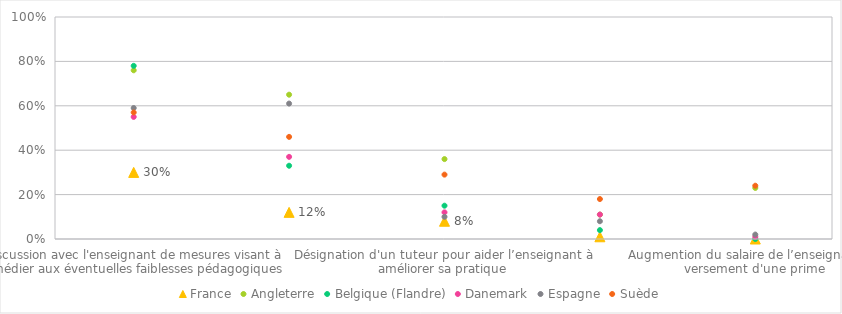
| Category | France | Angleterre | Belgique (Flandre) | Danemark | Espagne | Suède |
|---|---|---|---|---|---|---|
| Discussion avec l'enseignant de mesures visant à remédier aux éventuelles faiblesses pédagogiques | 0.3 | 0.76 | 0.78 | 0.55 | 0.59 | 0.57 |
| Élaboration d'un plan de formation | 0.12 | 0.65 | 0.33 | 0.37 | 0.61 | 0.46 |
| Désignation d'un tuteur pour aider l’enseignant à améliorer sa pratique | 0.08 | 0.36 | 0.15 | 0.12 | 0.1 | 0.29 |
| Changement dans les responsabilités professionnelles de l’enseignant | 0.01 | 0.11 | 0.04 | 0.11 | 0.08 | 0.18 |
| Augmention du salaire de l’enseignant ou versement d'une prime | 0 | 0.23 | 0 | 0.01 | 0.02 | 0.24 |